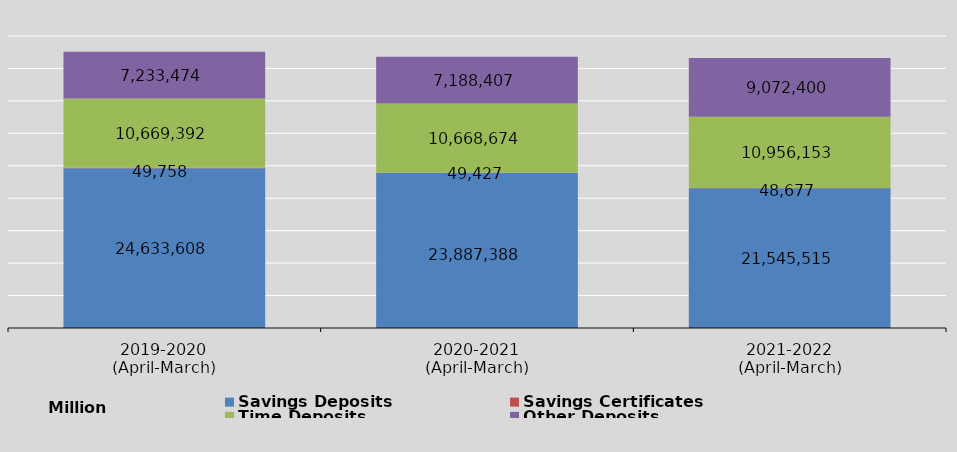
| Category | Savings Deposits | Savings Certificates | Time Deposits | Other Deposits |
|---|---|---|---|---|
| 2019-2020
(April-March) | 24633607.82 | 49758.48 | 10669392.05 | 7233473.82 |
| 2020-2021
(April-March) | 23887388 | 49427 | 10668674 | 7188407 |
| 2021-2022
(April-March) | 21545515 | 48677 | 10956153 | 9072400 |